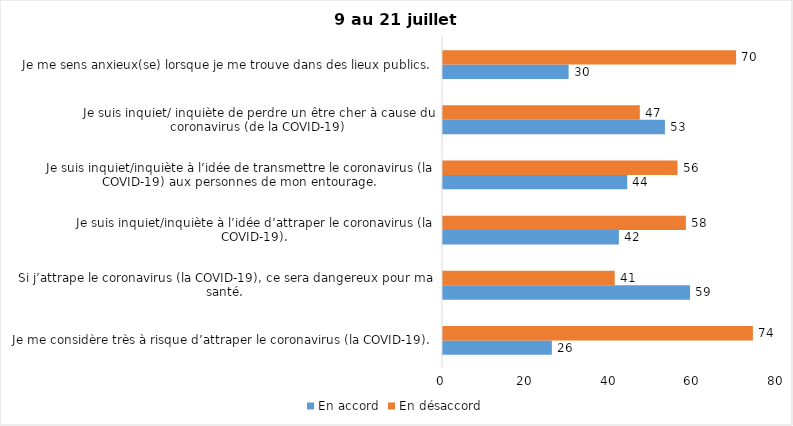
| Category | En accord | En désaccord |
|---|---|---|
| Je me considère très à risque d’attraper le coronavirus (la COVID-19). | 26 | 74 |
| Si j’attrape le coronavirus (la COVID-19), ce sera dangereux pour ma santé. | 59 | 41 |
| Je suis inquiet/inquiète à l’idée d’attraper le coronavirus (la COVID-19). | 42 | 58 |
| Je suis inquiet/inquiète à l’idée de transmettre le coronavirus (la COVID-19) aux personnes de mon entourage. | 44 | 56 |
| Je suis inquiet/ inquiète de perdre un être cher à cause du coronavirus (de la COVID-19) | 53 | 47 |
| Je me sens anxieux(se) lorsque je me trouve dans des lieux publics. | 30 | 70 |